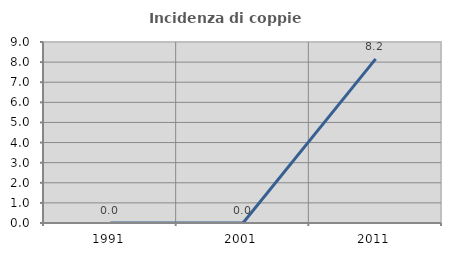
| Category | Incidenza di coppie miste |
|---|---|
| 1991.0 | 0 |
| 2001.0 | 0 |
| 2011.0 | 8.163 |